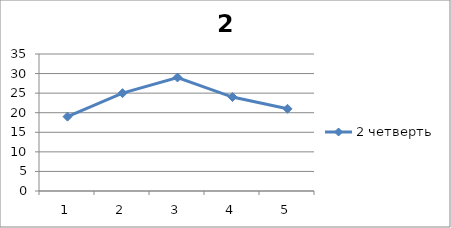
| Category | 2 четверть |
|---|---|
| 0 | 19 |
| 1 | 25 |
| 2 | 29 |
| 3 | 24 |
| 4 | 21 |